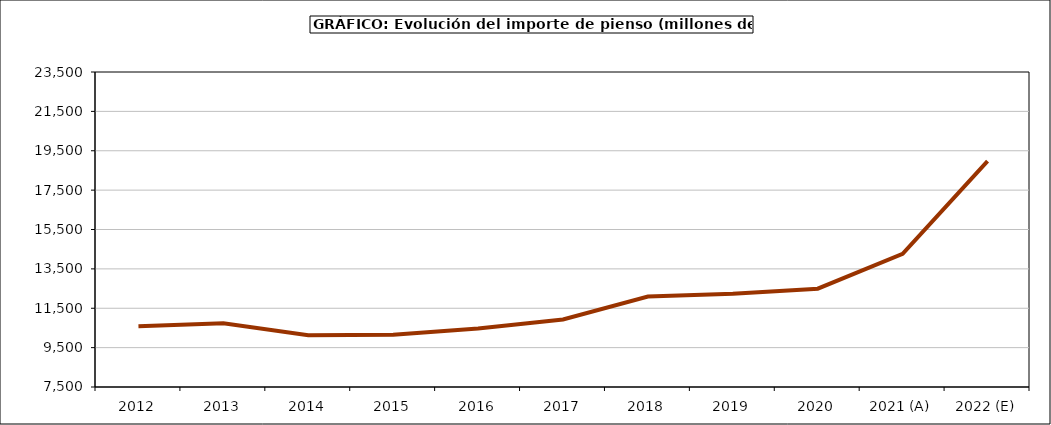
| Category | piensos |
|---|---|
| 2012 | 10588.115 |
| 2013 | 10733.318 |
| 2014 | 10132.591 |
| 2015 | 10154.98 |
| 2016 | 10470.8 |
| 2017 | 10928.619 |
| 2018 | 12095.55 |
| 2019 | 12231.73 |
| 2020 | 12494.182 |
| 2021 (A) | 14263.492 |
| 2022 (E) | 18976.496 |